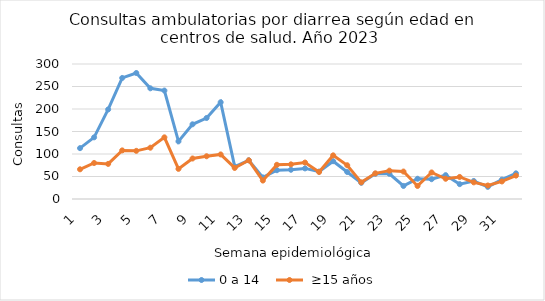
| Category | 0 a 14  |  ≥15 años |
|---|---|---|
| 1.0 | 113 | 66 |
| 2.0 | 137 | 80 |
| 3.0 | 199 | 78 |
| 4.0 | 269 | 108 |
| 5.0 | 280 | 107 |
| 6.0 | 246 | 114 |
| 7.0 | 241 | 137 |
| 8.0 | 128 | 67 |
| 9.0 | 166 | 90 |
| 10.0 | 180 | 95 |
| 11.0 | 215 | 99 |
| 12.0 | 72 | 69 |
| 13.0 | 86 | 86 |
| 14.0 | 48 | 41 |
| 15.0 | 64 | 76 |
| 16.0 | 65 | 77 |
| 17.0 | 68 | 81 |
| 18.0 | 61 | 60 |
| 19.0 | 84 | 97 |
| 20.0 | 60 | 75 |
| 21.0 | 36 | 37 |
| 22.0 | 56 | 57 |
| 23.0 | 56 | 63 |
| 24.0 | 29 | 61 |
| 25.0 | 45 | 29 |
| 26.0 | 44 | 59 |
| 27.0 | 53 | 45 |
| 28.0 | 33 | 49 |
| 29.0 | 40 | 37 |
| 30.0 | 27 | 30 |
| 31.0 | 43 | 39 |
| 32.0 | 57 | 52 |